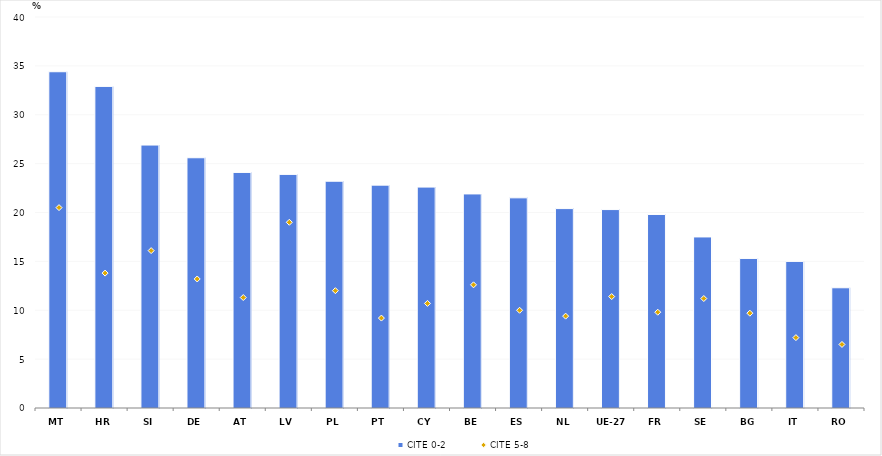
| Category | CITE 0-2 |
|---|---|
| MT | 34.4 |
| HR | 32.9 |
| SI | 26.9 |
| DE | 25.6 |
| AT | 24.1 |
| LV | 23.9 |
| PL | 23.2 |
| PT | 22.8 |
| CY | 22.6 |
| BE | 21.9 |
| ES | 21.5 |
| NL | 20.4 |
| UE-27 | 20.3 |
| FR | 19.8 |
| SE | 17.5 |
| BG | 15.3 |
| IT | 15 |
| RO | 12.3 |